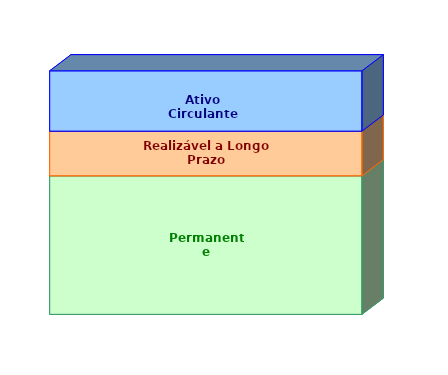
| Category | Permanente | Realizável a Longo Prazo | Ativo Circulante |
|---|---|---|---|
| 0 | 0.569 | 0.183 | 0.248 |